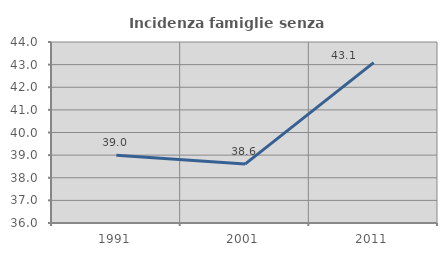
| Category | Incidenza famiglie senza nuclei |
|---|---|
| 1991.0 | 38.992 |
| 2001.0 | 38.605 |
| 2011.0 | 43.091 |